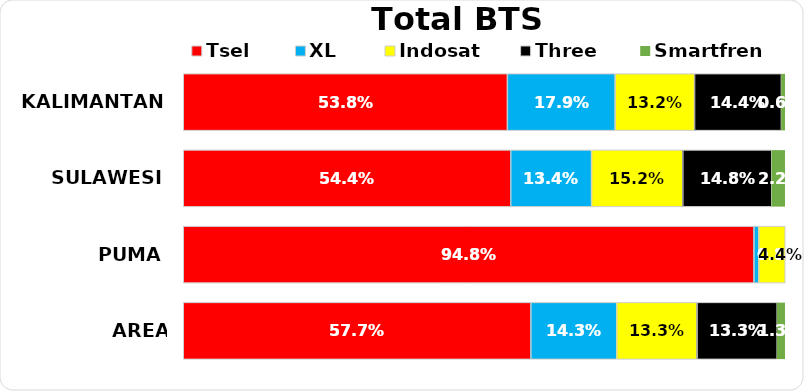
| Category | Tsel | XL | Indosat | Three | Smartfren |
|---|---|---|---|---|---|
| KALIMANTAN | 0.538 | 0.179 | 0.132 | 0.144 | 0.006 |
| SULAWESI | 0.544 | 0.134 | 0.152 | 0.148 | 0.022 |
| PUMA | 0.948 | 0.008 | 0.044 | 0 | 0 |
| AREA PAMASUKA | 0.577 | 0.143 | 0.133 | 0.133 | 0.013 |